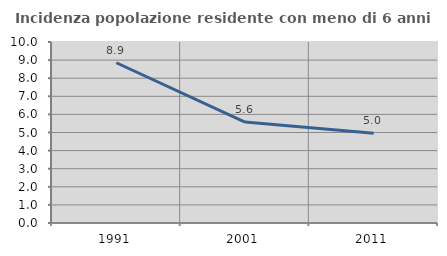
| Category | Incidenza popolazione residente con meno di 6 anni |
|---|---|
| 1991.0 | 8.854 |
| 2001.0 | 5.579 |
| 2011.0 | 4.958 |